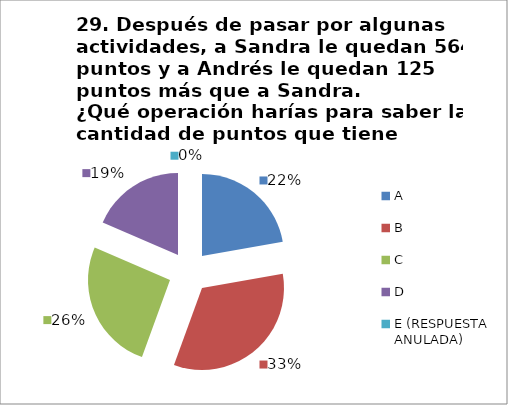
| Category | CANTIDAD DE RESPUESTAS PREGUNTA (29) | PORCENTAJE |
|---|---|---|
| A | 6 | 0.222 |
| B | 9 | 0.333 |
| C | 7 | 0.259 |
| D | 5 | 0.185 |
| E (RESPUESTA ANULADA) | 0 | 0 |